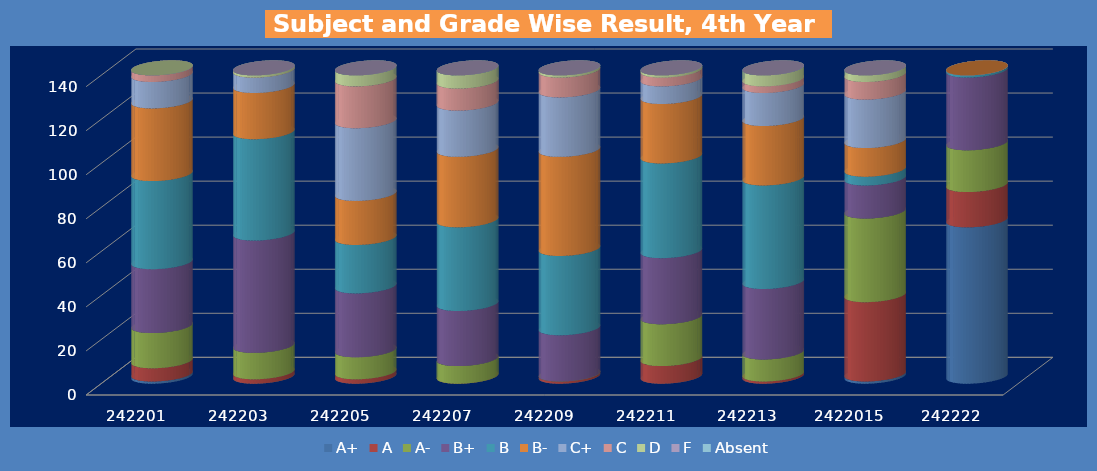
| Category | A+ | A | A- | B+ | B | B- | C+ | C | D | F | Absent |
|---|---|---|---|---|---|---|---|---|---|---|---|
| 242201.0 | 1 | 6 | 16 | 29 | 40 | 33 | 12 | 3 | 0 | 0 | 0 |
| 242203.0 | 0 | 2 | 12 | 51 | 46 | 21 | 7 | 0 | 1 | 0 | 0 |
| 242205.0 | 0 | 2 | 10 | 29 | 22 | 20 | 33 | 19 | 5 | 0 | 0 |
| 242207.0 | 0 | 0 | 8 | 25 | 38 | 32 | 21 | 10 | 6 | 0 | 0 |
| 242209.0 | 0 | 1 | 0 | 21 | 36 | 45 | 27 | 9 | 1 | 0 | 0 |
| 242211.0 | 0 | 8 | 19 | 30 | 43 | 27 | 8 | 4 | 1 | 0 | 0 |
| 242213.0 | 0 | 1 | 10 | 32 | 47 | 27 | 15 | 3 | 5 | 0 | 0 |
| 2422015.0 | 1 | 36 | 38 | 15 | 4 | 13 | 22 | 8 | 3 | 0 | 0 |
| 242222.0 | 71 | 16 | 19 | 33 | 1 | 0 | 0 | 0 | 0 | 0 | 0 |